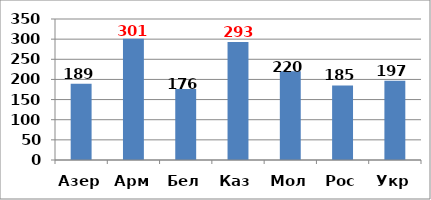
| Category | Series 0 |
|---|---|
| Азер | 189 |
| Арм | 301 |
| Бел | 176 |
| Каз | 293 |
| Мол | 220 |
| Рос | 185 |
| Укр | 197 |